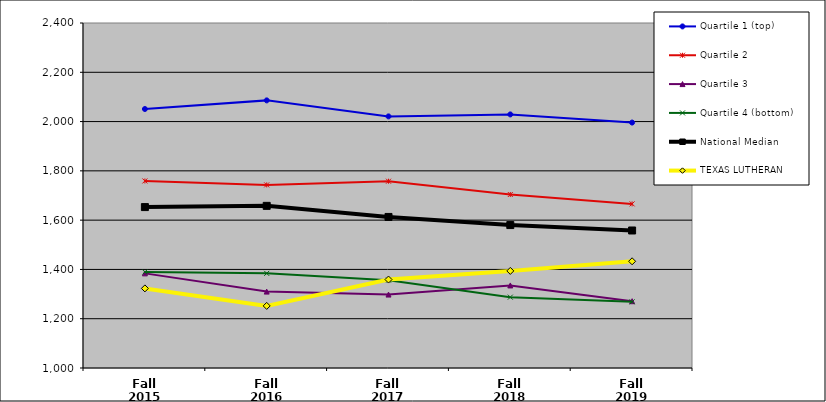
| Category | Quartile 1 (top) | Quartile 2 | Quartile 3 | Quartile 4 (bottom) | National Median | TEXAS LUTHERAN |
|---|---|---|---|---|---|---|
| Fall 2015 | 2051 | 1759 | 1384 | 1389.5 | 1653 | 1323 |
| Fall 2016 | 2086 | 1743 | 1310 | 1384 | 1658 | 1252 |
| Fall 2017 | 2021 | 1758 | 1298 | 1356.5 | 1613 | 1359 |
| Fall 2018 | 2029 | 1704 | 1335 | 1287.5 | 1580 | 1394 |
| Fall 2019 | 1996 | 1666 | 1271 | 1268.5 | 1558 | 1433 |